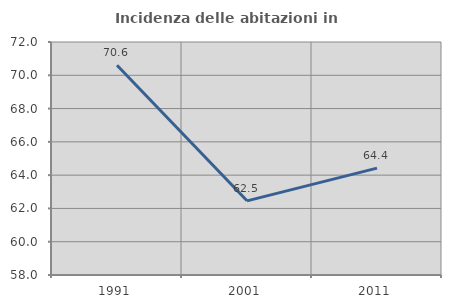
| Category | Incidenza delle abitazioni in proprietà  |
|---|---|
| 1991.0 | 70.6 |
| 2001.0 | 62.456 |
| 2011.0 | 64.42 |